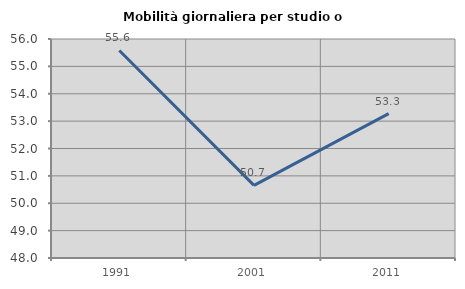
| Category | Mobilità giornaliera per studio o lavoro |
|---|---|
| 1991.0 | 55.58 |
| 2001.0 | 50.654 |
| 2011.0 | 53.272 |